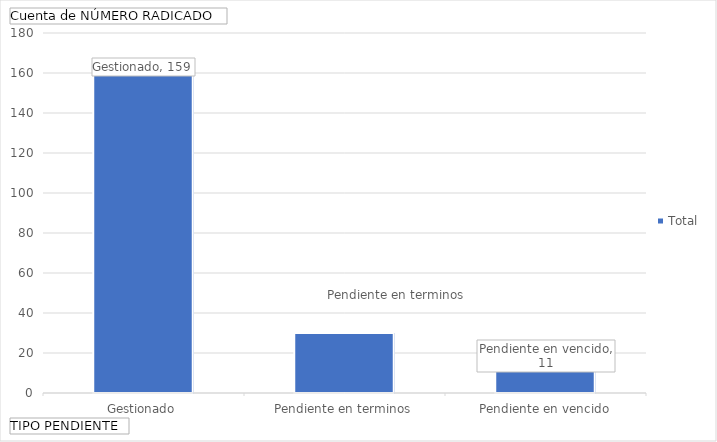
| Category | Total |
|---|---|
| Gestionado | 159 |
| Pendiente en terminos | 30 |
| Pendiente en vencido | 11 |